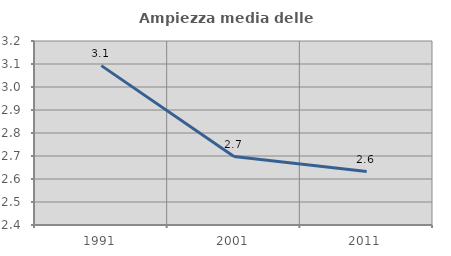
| Category | Ampiezza media delle famiglie |
|---|---|
| 1991.0 | 3.093 |
| 2001.0 | 2.697 |
| 2011.0 | 2.633 |